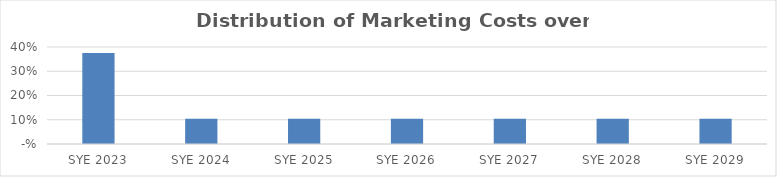
| Category | Series 0 |
|---|---|
| 2023.0 | 0.375 |
| 2024.0 | 0.104 |
| 2025.0 | 0.104 |
| 2026.0 | 0.104 |
| 2027.0 | 0.104 |
| 2028.0 | 0.104 |
| 2029.0 | 0.104 |